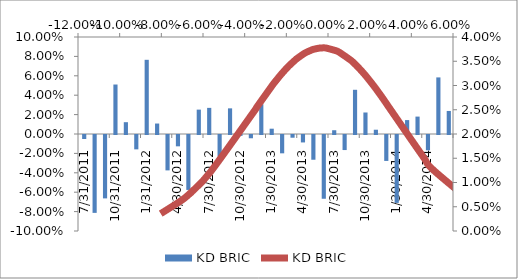
| Category | KD BRIC |
|---|---|
| 31/07/2011 | -0.004 |
| 31/08/2011 | -0.08 |
| 30/09/2011 | -0.065 |
| 31/10/2011 | 0.051 |
| 30/11/2011 | 0.012 |
| 31/12/2011 | -0.015 |
| 31/01/2012 | 0.076 |
| 29/02/2012 | 0.011 |
| 31/03/2012 | -0.036 |
| 30/04/2012 | -0.012 |
| 31/05/2012 | -0.057 |
| 30/06/2012 | 0.025 |
| 31/07/2012 | 0.027 |
| 31/08/2012 | -0.022 |
| 30/09/2012 | 0.026 |
| 31/10/2012 | -0.001 |
| 30/11/2012 | -0.003 |
| 31/12/2012 | 0.031 |
| 31/01/2013 | 0.005 |
| 28/02/2013 | -0.019 |
| 31/03/2013 | -0.003 |
| 30/04/2013 | -0.008 |
| 31/05/2013 | -0.026 |
| 30/06/2013 | -0.066 |
| 31/07/2013 | 0.004 |
| 31/08/2013 | -0.016 |
| 30/09/2013 | 0.046 |
| 31/10/2013 | 0.022 |
| 30/11/2013 | 0.004 |
| 31/12/2013 | -0.027 |
| 31/01/2014 | -0.07 |
| 28/02/2014 | 0.014 |
| 31/03/2014 | 0.018 |
| 30/04/2014 | -0.016 |
| 31/05/2014 | 0.058 |
| 30/06/2014 | 0.024 |